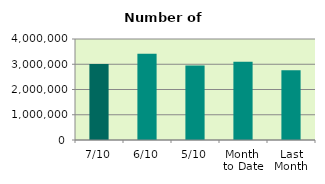
| Category | Series 0 |
|---|---|
| 7/10 | 3005960 |
| 6/10 | 3411378 |
| 5/10 | 2954954 |
| Month 
to Date | 3096842 |
| Last
Month | 2759252.364 |